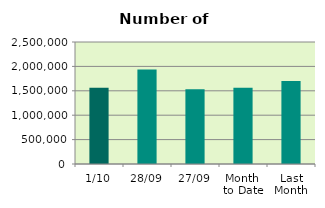
| Category | Series 0 |
|---|---|
| 1/10 | 1562112 |
| 28/09 | 1934706 |
| 27/09 | 1531720 |
| Month 
to Date | 1562112 |
| Last
Month | 1700207.9 |